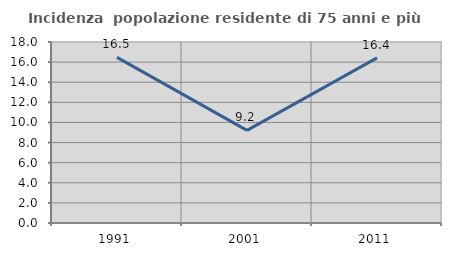
| Category | Incidenza  popolazione residente di 75 anni e più |
|---|---|
| 1991.0 | 16.471 |
| 2001.0 | 9.211 |
| 2011.0 | 16.418 |